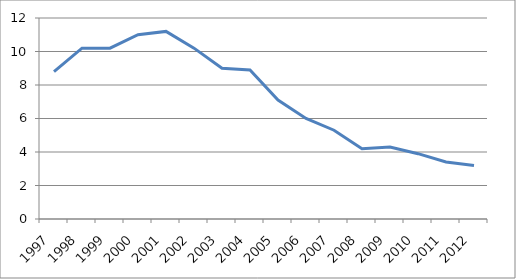
| Category | Penetración |
|---|---|
| 1997.0 | 8.8 |
| 1998.0 | 10.2 |
| 1999.0 | 10.2 |
| 2000.0 | 11 |
| 2001.0 | 11.2 |
| 2002.0 | 10.2 |
| 2003.0 | 9 |
| 2004.0 | 8.9 |
| 2005.0 | 7.1 |
| 2006.0 | 6 |
| 2007.0 | 5.3 |
| 2008.0 | 4.2 |
| 2009.0 | 4.3 |
| 2010.0 | 3.9 |
| 2011.0 | 3.4 |
| 2012.0 | 3.2 |